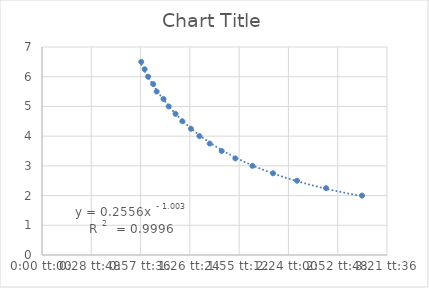
| Category | Series 0 |
|---|---|
| 0.12986111111111112 | 2 |
| 0.11527777777777777 | 2.25 |
| 0.10347222222222223 | 2.5 |
| 0.09375 | 2.75 |
| 0.08541666666666665 | 3 |
| 0.07847222222222222 | 3.25 |
| 0.07291666666666667 | 3.5 |
| 0.06805555555555555 | 3.75 |
| 0.06388888888888888 | 4 |
| 0.06041666666666667 | 4.25 |
| 0.05694444444444444 | 4.5 |
| 0.05416666666666667 | 4.75 |
| 0.051388888888888894 | 5 |
| 0.049305555555555554 | 5.25 |
| 0.04652777777777778 | 5.5 |
| 0.04513888888888889 | 5.75 |
| 0.04305555555555556 | 6 |
| 0.041666666666666664 | 6.25 |
| 0.04027777777777778 | 6.5 |